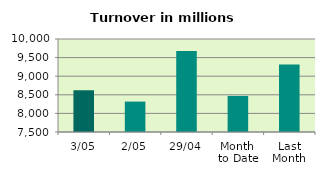
| Category | Series 0 |
|---|---|
| 3/05 | 8622.093 |
| 2/05 | 8317.58 |
| 29/04 | 9680.551 |
| Month 
to Date | 8469.836 |
| Last
Month | 9311.354 |